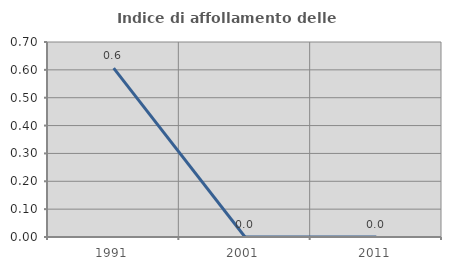
| Category | Indice di affollamento delle abitazioni  |
|---|---|
| 1991.0 | 0.606 |
| 2001.0 | 0 |
| 2011.0 | 0 |